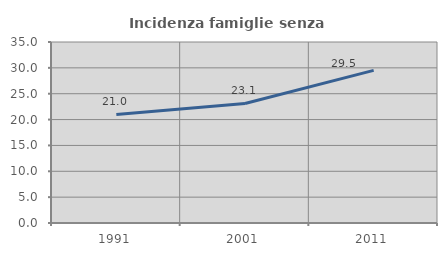
| Category | Incidenza famiglie senza nuclei |
|---|---|
| 1991.0 | 20.983 |
| 2001.0 | 23.111 |
| 2011.0 | 29.507 |